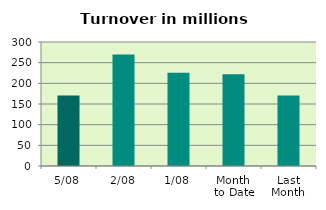
| Category | Series 0 |
|---|---|
| 5/08 | 170.576 |
| 2/08 | 269.912 |
| 1/08 | 225.643 |
| Month 
to Date | 222.043 |
| Last
Month | 170.387 |